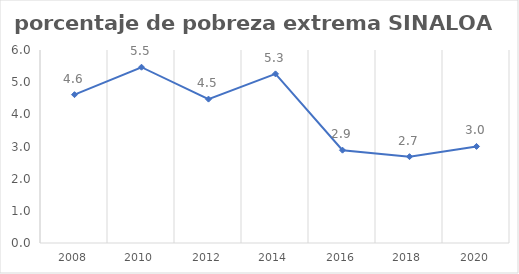
| Category | Series 0 |
|---|---|
| 2008.0 | 4.612 |
| 2010.0 | 5.465 |
| 2012.0 | 4.473 |
| 2014.0 | 5.257 |
| 2016.0 | 2.886 |
| 2018.0 | 2.684 |
| 2020.0 | 3.002 |